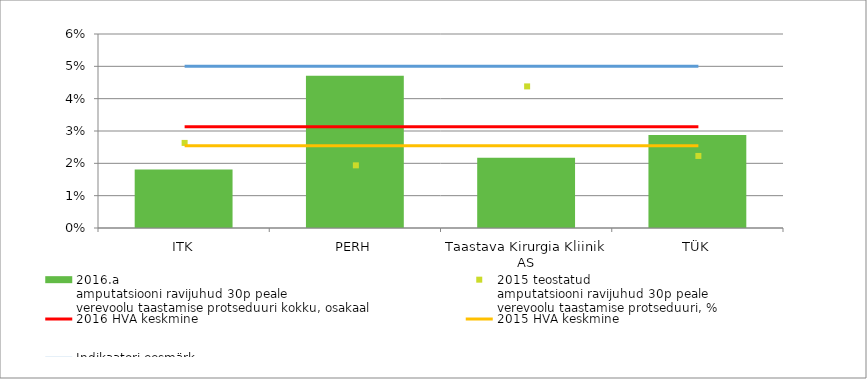
| Category | 2016.a
amputatsiooni ravijuhud 30p peale
verevoolu taastamise protseduuri kokku, osakaal |
|---|---|
| ITK | 0.018 |
| PERH | 0.047 |
| Taastava Kirurgia Kliinik AS | 0.022 |
| TÜK | 0.029 |